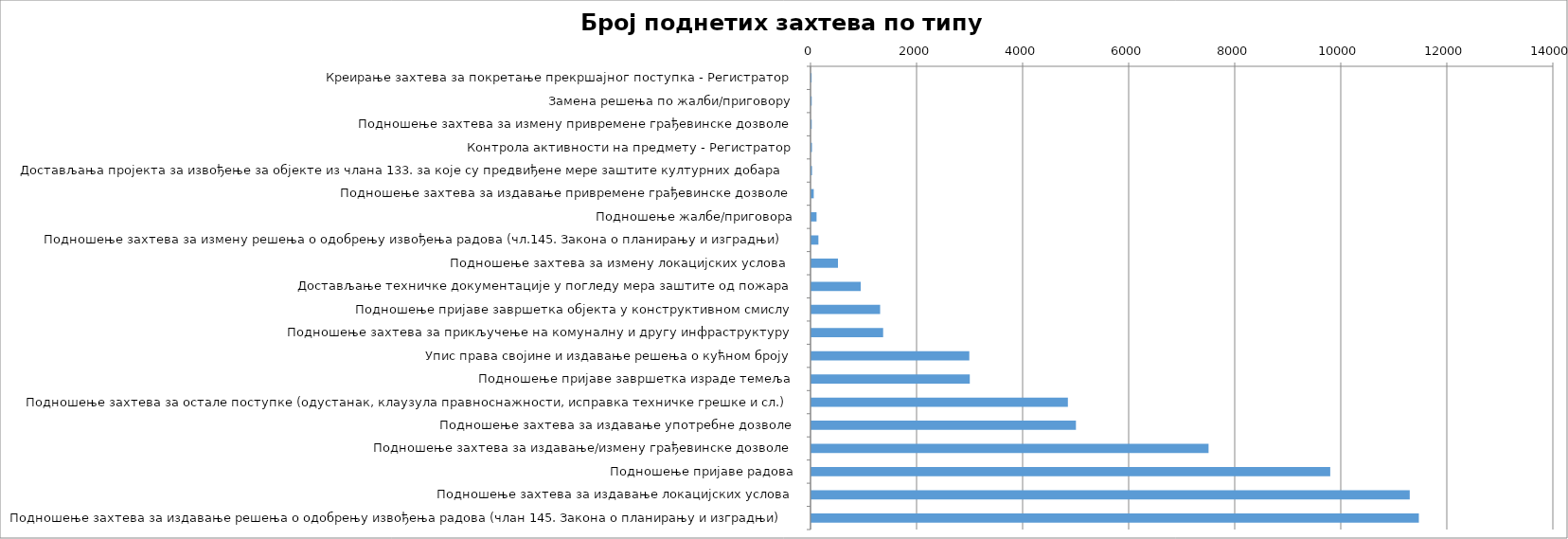
| Category | Број поднетих захтева |
|---|---|
| Креирање захтева за покретање прекршајног поступка - Регистратор | 3 |
| Замена решења по жалби/приговору | 5 |
| Подношење захтева за измену привремене грађевинске дозволе | 5 |
| Контрола активности на предмету - Регистратор | 10 |
| Достављања пројекта за извођење за објекте из члана 133. за које су предвиђене мере заштите културних добара | 11 |
| Подношење захтева за издавање привремене грађевинске дозволе | 43 |
| Подношење жалбе/приговора | 96 |
| Подношење захтева за измену решења о одобрењу извођења радова (чл.145. Закона о планирању и изградњи) | 131 |
| Подношење захтева за измену локацијских услова  | 500 |
| Достављање техничке документације у погледу мера заштите од пожара | 929 |
| Подношење пријаве завршетка објекта у конструктивном смислу | 1295 |
| Подношење захтева за прикључење на комуналну и другу инфраструктуру | 1352 |
| Упис права својине и издавање решења о кућном броју | 2977 |
| Подношење пријаве завршетка израде темеља | 2986 |
| Подношење захтева за остале поступке (одустанак, клаузула правноснажности, исправка техничке грешке и сл.) | 4836 |
| Подношење захтева за издавање употребне дозволе | 4988 |
| Подношење захтева за издавање/измену грађевинске дозволе | 7489 |
| Подношење пријаве радова | 9784 |
| Подношење захтева за издавање локацијских услова | 11283 |
| Подношење захтева за издавање решења о одобрењу извођења радова (члан 145. Закона о планирању и изградњи) | 11455 |